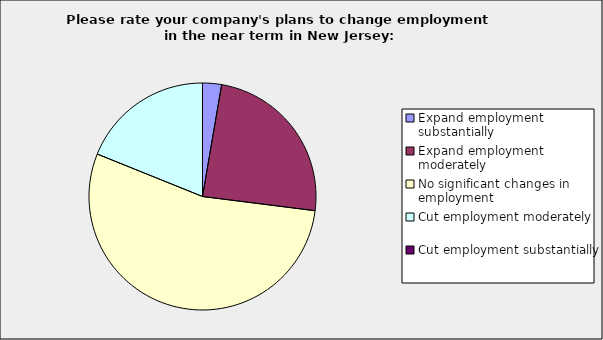
| Category | Series 0 |
|---|---|
| Expand employment substantially | 0.027 |
| Expand employment moderately | 0.243 |
| No significant changes in employment | 0.541 |
| Cut employment moderately | 0.189 |
| Cut employment substantially | 0 |